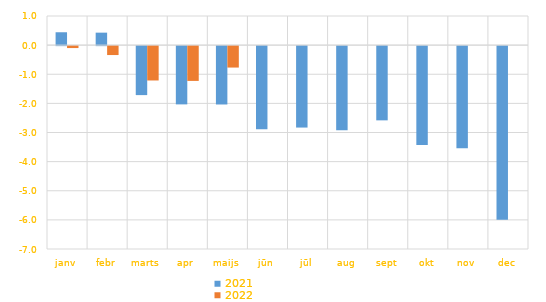
| Category | 2021 | 2022 |
|---|---|---|
| janv | 0.442 | -0.066 |
| febr | 0.428 | -0.306 |
| marts | -1.682 | -1.18 |
| apr | -2 | -1.195 |
| maijs | -2.004 | -0.736 |
| jūn | -2.854 | 0 |
| jūl | -2.796 | 0 |
| aug | -2.887 | 0 |
| sept | -2.549 | 0 |
| okt | -3.396 | 0 |
| nov | -3.509 | 0 |
| dec | -5.957 | 0 |